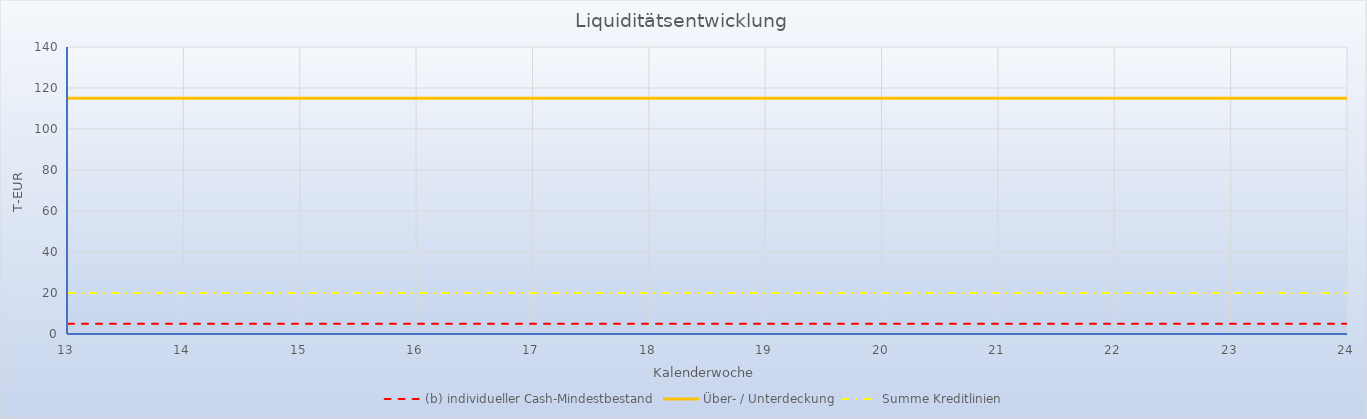
| Category | (b) individueller Cash-Mindestbestand |  Über- / Unterdeckung  |  Summe Kreditlinien  |
|---|---|---|---|
| 13.0 | 5 | 115 | 20 |
| 14.0 | 5 | 115 | 20 |
| 15.0 | 5 | 115 | 20 |
| 16.0 | 5 | 115 | 20 |
| 17.0 | 5 | 115 | 20 |
| 18.0 | 5 | 115 | 20 |
| 19.0 | 5 | 115 | 20 |
| 20.0 | 5 | 115 | 20 |
| 21.0 | 5 | 115 | 20 |
| 22.0 | 5 | 115 | 20 |
| 23.0 | 5 | 115 | 20 |
| 24.0 | 5 | 115 | 20 |